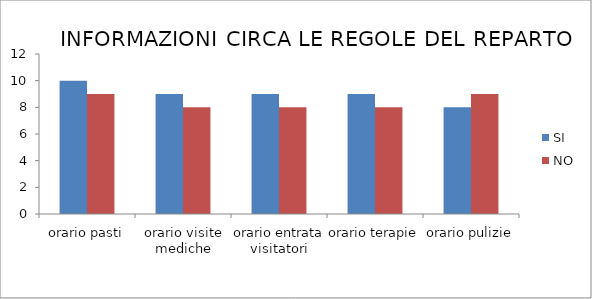
| Category | SI | NO |
|---|---|---|
| orario pasti | 10 | 9 |
| orario visite mediche | 9 | 8 |
| orario entrata visitatori | 9 | 8 |
| orario terapie | 9 | 8 |
| orario pulizie | 8 | 9 |